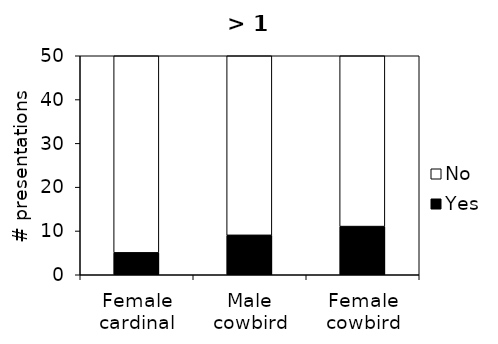
| Category | Yes | No |
|---|---|---|
| Female cardinal | 5 | 45 |
| Male cowbird | 9 | 41 |
| Female cowbird | 11 | 39 |